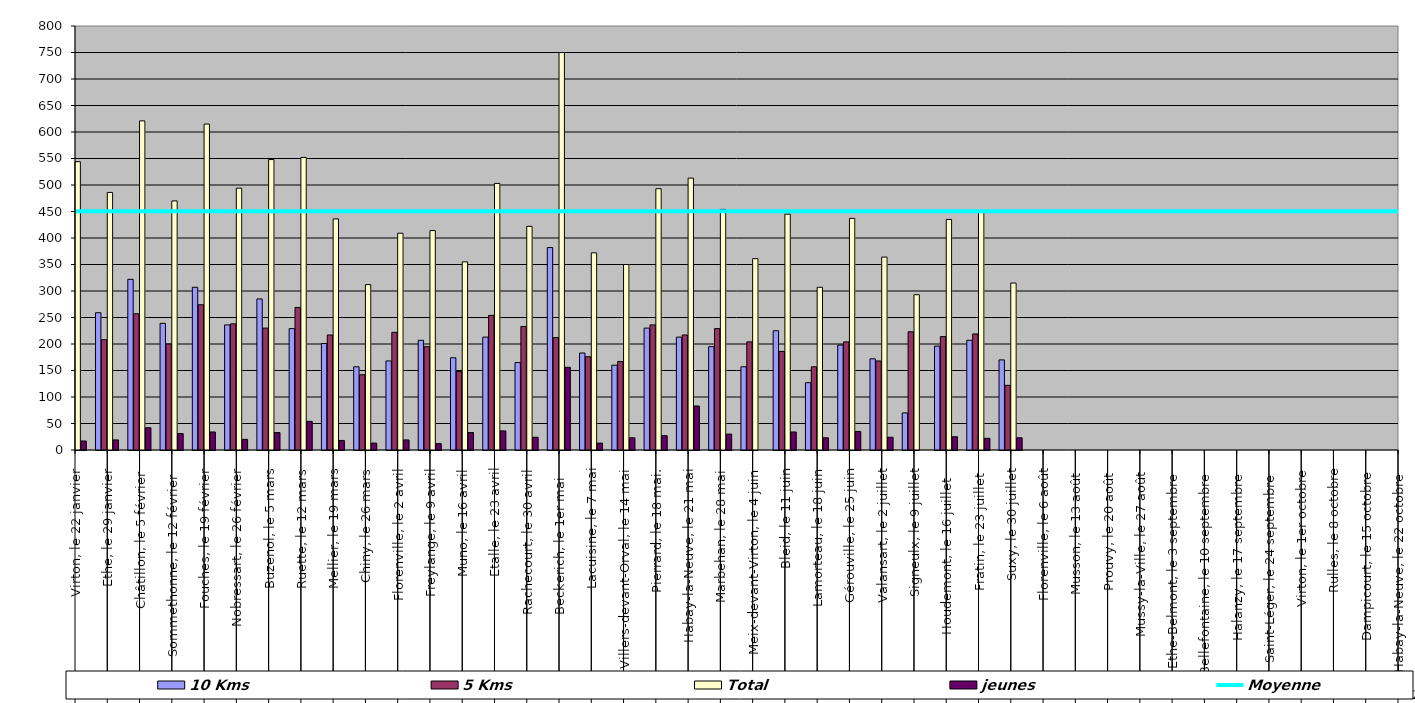
| Category | 10 Kms | 5 Kms | Total | jeunes |
|---|---|---|---|---|
| 0 | 296 | 231 | 544 | 17 |
| 1 | 259 | 208 | 486 | 19 |
| 2 | 322 | 257 | 621 | 42 |
| 3 | 239 | 200 | 470 | 31 |
| 4 | 307 | 274 | 615 | 34 |
| 5 | 236 | 238 | 494 | 20 |
| 6 | 285 | 230 | 548 | 33 |
| 7 | 229 | 269 | 552 | 54 |
| 8 | 201 | 217 | 436 | 18 |
| 9 | 157 | 142 | 312 | 13 |
| 10 | 168 | 222 | 409 | 19 |
| 11 | 207 | 195 | 414 | 12 |
| 12 | 174 | 148 | 355 | 33 |
| 13 | 213 | 254 | 503 | 36 |
| 14 | 165 | 233 | 422 | 24 |
| 15 | 382 | 212 | 750 | 156 |
| 16 | 183 | 176 | 372 | 13 |
| 17 | 160 | 167 | 350 | 23 |
| 18 | 230 | 236 | 493 | 27 |
| 19 | 213 | 217 | 513 | 83 |
| 20 | 195 | 229 | 454 | 30 |
| 21 | 157 | 204 | 361 | 0 |
| 22 | 225 | 186 | 445 | 34 |
| 23 | 127 | 157 | 307 | 23 |
| 24 | 198 | 204 | 437 | 35 |
| 25 | 172 | 168 | 364 | 24 |
| 26 | 70 | 223 | 293 | 0 |
| 27 | 196 | 214 | 435 | 25 |
| 28 | 207 | 219 | 448 | 22 |
| 29 | 170 | 122 | 315 | 23 |
| 30 | 0 | 0 | 0 | 0 |
| 31 | 0 | 0 | 0 | 0 |
| 32 | 0 | 0 | 0 | 0 |
| 33 | 0 | 0 | 0 | 0 |
| 34 | 0 | 0 | 0 | 0 |
| 35 | 0 | 0 | 0 | 0 |
| 36 | 0 | 0 | 0 | 0 |
| 37 | 0 | 0 | 0 | 0 |
| 38 | 0 | 0 | 0 | 0 |
| 39 | 0 | 0 | 0 | 0 |
| 40 | 0 | 0 | 0 | 0 |
| 41 | 0 | 0 | 0 | 0 |